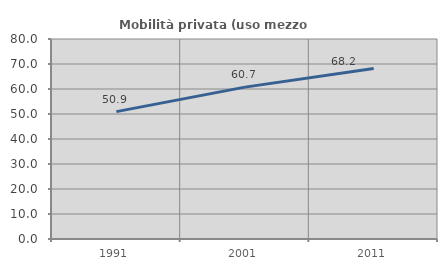
| Category | Mobilità privata (uso mezzo privato) |
|---|---|
| 1991.0 | 50.945 |
| 2001.0 | 60.749 |
| 2011.0 | 68.159 |